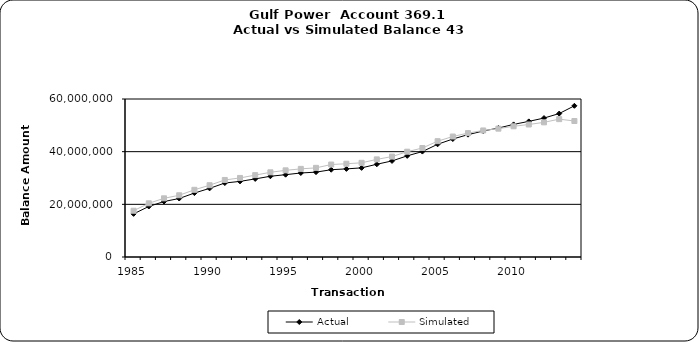
| Category | Actual | Simulated |
|---|---|---|
| 1985.0 | 16382238.12 | 17565655.037 |
| 1986.0 | 19187616.12 | 20394070.256 |
| 1987.0 | 21069907.32 | 22281649.544 |
| 1988.0 | 22209693.03 | 23445263.874 |
| 1989.0 | 24284458.03 | 25518706.725 |
| 1990.0 | 26064781.03 | 27260283.9 |
| 1991.0 | 28086075.03 | 29254592.682 |
| 1992.0 | 28714738.58 | 30025347.446 |
| 1993.0 | 29651323.05 | 31092765.539 |
| 1994.0 | 30658889.61 | 32165526.942 |
| 1995.0 | 31259081.52 | 32908049.145 |
| 1996.0 | 31898889.66 | 33468376.763 |
| 1997.0 | 32230915.66 | 33852175.896 |
| 1998.0 | 33145486.66 | 35111606.641 |
| 1999.0 | 33463711.66 | 35414117.421 |
| 2000.0 | 33846214.66 | 35771286.357 |
| 2001.0 | 35218963.73 | 37067438.41 |
| 2002.0 | 36481528.43 | 38142319.577 |
| 2003.0 | 38412477.23 | 39989018.101 |
| 2004.0 | 40035393.36 | 41383548.181 |
| 2005.0 | 42804558.36 | 43980997.867 |
| 2006.0 | 44800197.36 | 45747823.497 |
| 2007.0 | 46455537.36 | 47055209.85 |
| 2008.0 | 47847538.36 | 48052998.275 |
| 2009.0 | 48970585.29 | 48739201.36 |
| 2010.0 | 50352811.48 | 49643489.321 |
| 2011.0 | 51498379.04 | 50319972.298 |
| 2012.0 | 52762456.31 | 51134192.102 |
| 2013.0 | 54467608.85 | 52351499.006 |
| 2014.0 | 57418874.3 | 51641270.051 |